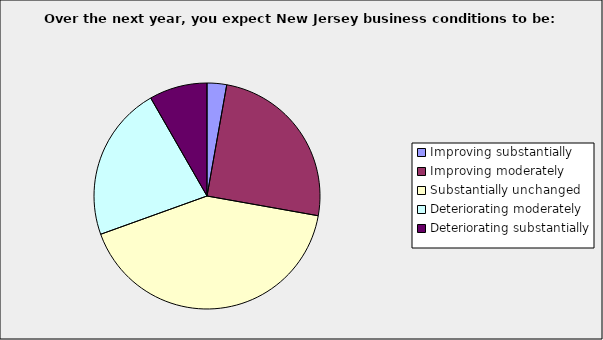
| Category | Series 0 |
|---|---|
| Improving substantially | 0.028 |
| Improving moderately | 0.25 |
| Substantially unchanged | 0.417 |
| Deteriorating moderately | 0.222 |
| Deteriorating substantially | 0.083 |